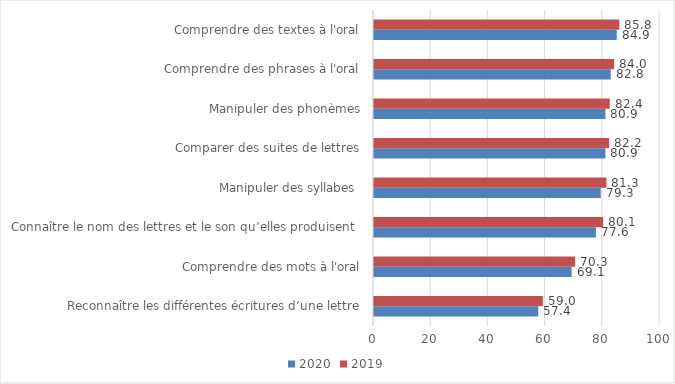
| Category | 2020 | 2019 |
|---|---|---|
| Reconnaître les différentes écritures d’une lettre | 57.44 | 59.03 |
| Comprendre des mots à l'oral | 69.11 | 70.28 |
| Connaître le nom des lettres et le son qu’elles produisent  | 77.58 | 80.09 |
| Manipuler des syllabes  | 79.28 | 81.28 |
| Comparer des suites de lettres | 80.92 | 82.19 |
| Manipuler des phonèmes | 80.93 | 82.42 |
| Comprendre des phrases à l'oral | 82.77 | 83.97 |
| Comprendre des textes à l'oral | 84.88 | 85.77 |